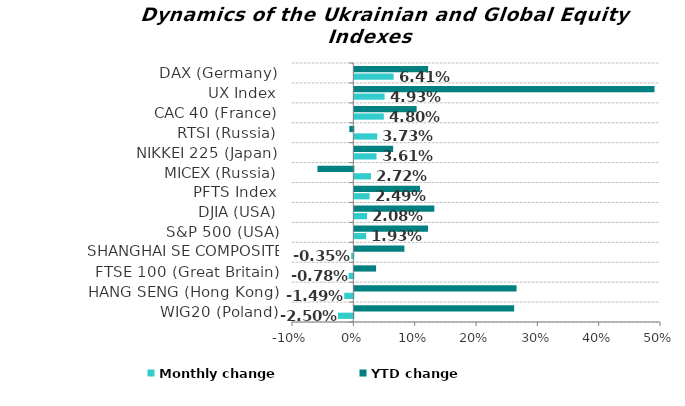
| Category | Monthly change | YTD change |
|---|---|---|
| WIG20 (Poland) | -0.025 | 0.261 |
| HANG SENG (Hong Kong) | -0.015 | 0.264 |
| FTSE 100 (Great Britain) | -0.008 | 0.035 |
| SHANGHAI SE COMPOSITE (China) | -0.004 | 0.082 |
| S&P 500 (USA) | 0.019 | 0.12 |
| DJIA (USA) | 0.021 | 0.13 |
| PFTS Index | 0.025 | 0.107 |
| MICEX (Russia) | 0.027 | -0.059 |
| NIKKEI 225 (Japan) | 0.036 | 0.063 |
| RTSI (Russia) | 0.037 | -0.007 |
| CAC 40 (France) | 0.048 | 0.102 |
| UX Index | 0.049 | 0.489 |
| DAX (Germany) | 0.064 | 0.12 |